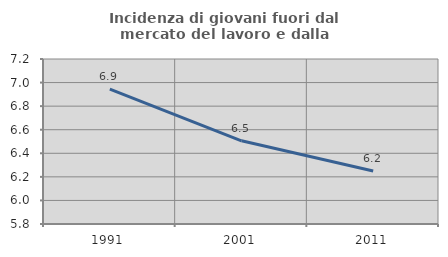
| Category | Incidenza di giovani fuori dal mercato del lavoro e dalla formazione  |
|---|---|
| 1991.0 | 6.944 |
| 2001.0 | 6.506 |
| 2011.0 | 6.249 |